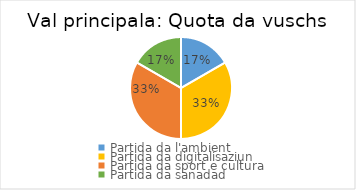
| Category | Quota da vuschs |
|---|---|
| Partida da l'ambient | 0.167 |
| Partida da digitalisaziun | 0.333 |
| Partida da sport e cultura  | 0.333 |
| Partida da sanadad  | 0.167 |